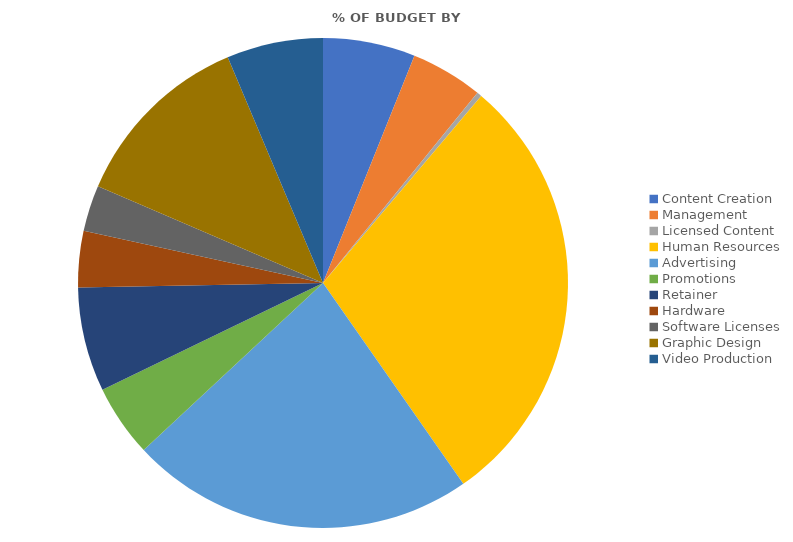
| Category | Series 0 | Series 1 |
|---|---|---|
| Content Creation | 23000 | 0.061 |
| Management | 18000 | 0.048 |
| Licensed Content | 1200 | 0.003 |
| Human Resources | 110000 | 0.291 |
| Advertising | 86000 | 0.228 |
| Promotions | 18000 | 0.048 |
| Retainer | 26000 | 0.069 |
| Hardware | 14000 | 0.037 |
| Software Licenses | 11500 | 0.03 |
| Graphic Design | 46000 | 0.122 |
| Video Production | 24000 | 0.064 |